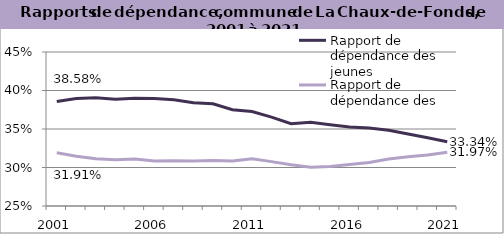
| Category | Rapport de dépendance des jeunes | Rapport de dépendance des personnes âgées |
|---|---|---|
| 2001.0 | 0.386 | 0.319 |
| 2002.0 | 0.39 | 0.315 |
| 2003.0 | 0.39 | 0.311 |
| 2004.0 | 0.389 | 0.31 |
| 2005.0 | 0.39 | 0.311 |
| 2006.0 | 0.39 | 0.308 |
| 2007.0 | 0.388 | 0.309 |
| 2008.0 | 0.384 | 0.308 |
| 2009.0 | 0.383 | 0.309 |
| 2010.0 | 0.375 | 0.308 |
| 2011.0 | 0.373 | 0.311 |
| 2012.0 | 0.366 | 0.308 |
| 2013.0 | 0.357 | 0.304 |
| 2014.0 | 0.359 | 0.3 |
| 2015.0 | 0.355 | 0.301 |
| 2016.0 | 0.353 | 0.304 |
| 2017.0 | 0.351 | 0.307 |
| 2018.0 | 0.348 | 0.311 |
| 2019.0 | 0.344 | 0.314 |
| 2020.0 | 0.339 | 0.316 |
| 2021.0 | 0.333 | 0.32 |